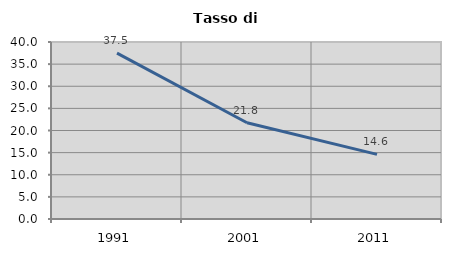
| Category | Tasso di disoccupazione   |
|---|---|
| 1991.0 | 37.5 |
| 2001.0 | 21.76 |
| 2011.0 | 14.61 |